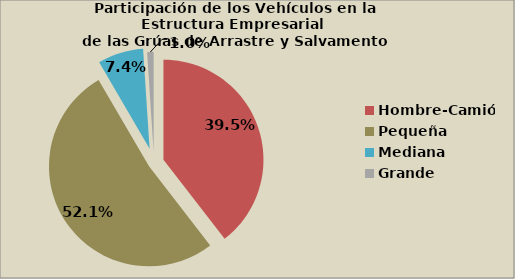
| Category | Series 0 |
|---|---|
| Hombre-Camión | 39.523 |
| Pequeña | 52.062 |
| Mediana | 7.374 |
| Grande | 1.042 |